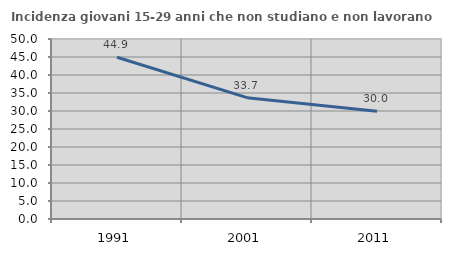
| Category | Incidenza giovani 15-29 anni che non studiano e non lavorano  |
|---|---|
| 1991.0 | 44.928 |
| 2001.0 | 33.703 |
| 2011.0 | 29.957 |